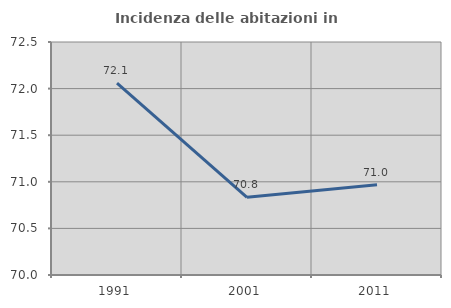
| Category | Incidenza delle abitazioni in proprietà  |
|---|---|
| 1991.0 | 72.059 |
| 2001.0 | 70.833 |
| 2011.0 | 70.968 |